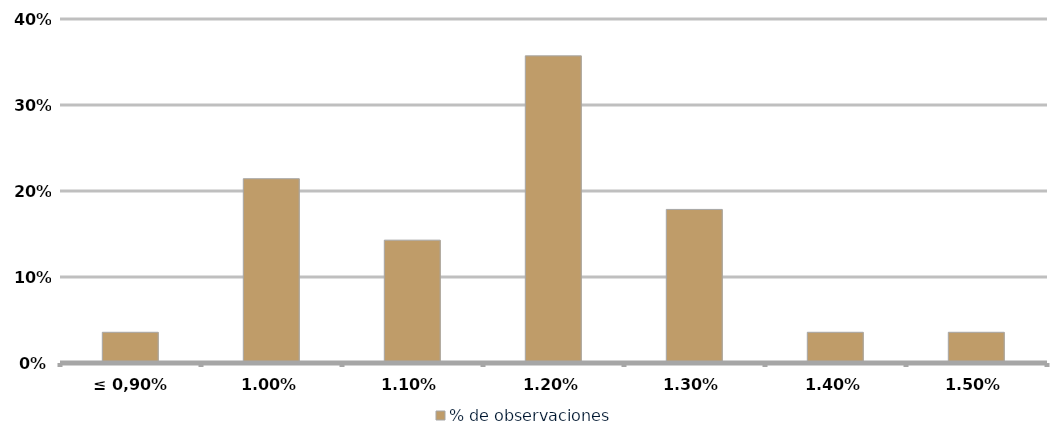
| Category | % de observaciones  |
|---|---|
| ≤ 0,90% | 0.036 |
| 1,00% | 0.214 |
| 1,10% | 0.143 |
| 1,20% | 0.357 |
| 1,30% | 0.179 |
| 1,40% | 0.036 |
| 1,50% | 0.036 |